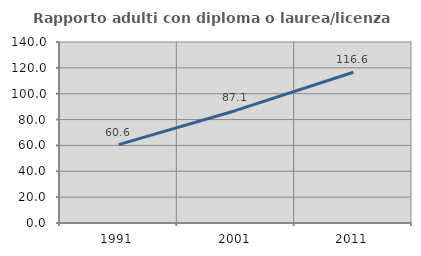
| Category | Rapporto adulti con diploma o laurea/licenza media  |
|---|---|
| 1991.0 | 60.597 |
| 2001.0 | 87.064 |
| 2011.0 | 116.607 |